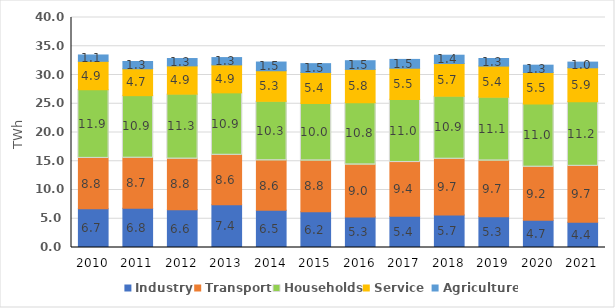
| Category | Industry | Transport | Households | Service  | Agriculture |
|---|---|---|---|---|---|
| 2010 | 6.719 | 8.776 | 11.942 | 4.942 | 1.105 |
| 2011 | 6.816 | 8.714 | 10.877 | 4.677 | 1.261 |
| 2012 | 6.56 | 8.813 | 11.291 | 4.921 | 1.279 |
| 2013 | 7.439 | 8.597 | 10.859 | 4.862 | 1.273 |
| 2014 | 6.464 | 8.624 | 10.329 | 5.322 | 1.516 |
| 2015 | 6.222 | 8.839 | 9.967 | 5.414 | 1.533 |
| 2016 | 5.324 | 9.035 | 10.822 | 5.794 | 1.509 |
| 2017 | 5.417 | 9.351 | 10.961 | 5.451 | 1.532 |
| 2018 | 5.674 | 9.678 | 10.945 | 5.702 | 1.444 |
| 2019 | 5.341 | 9.708 | 11.064 | 5.435 | 1.318 |
| 2020 | 4.745 | 9.22 | 10.987 | 5.484 | 1.273 |
| 2021 | 4.398 | 9.72 | 11.225 | 5.909 | 0.991 |